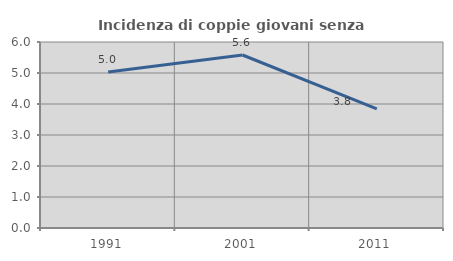
| Category | Incidenza di coppie giovani senza figli |
|---|---|
| 1991.0 | 5.03 |
| 2001.0 | 5.581 |
| 2011.0 | 3.846 |